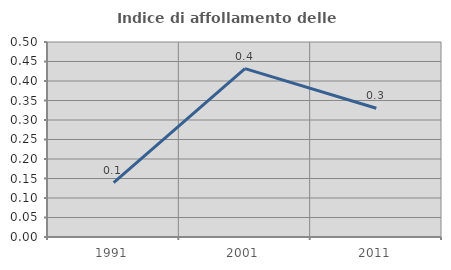
| Category | Indice di affollamento delle abitazioni  |
|---|---|
| 1991.0 | 0.14 |
| 2001.0 | 0.432 |
| 2011.0 | 0.33 |